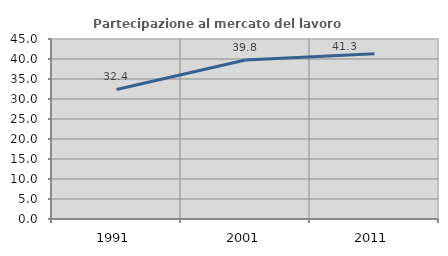
| Category | Partecipazione al mercato del lavoro  femminile |
|---|---|
| 1991.0 | 32.386 |
| 2001.0 | 39.766 |
| 2011.0 | 41.317 |